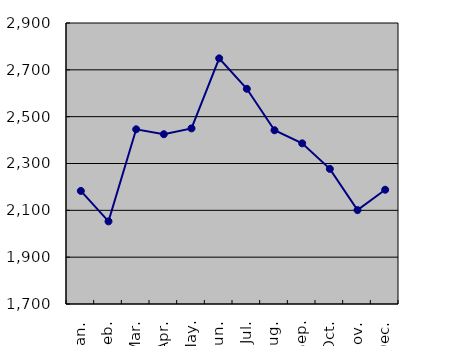
| Category | Series 0 |
|---|---|
| Jan. | 2183 |
| Feb. | 2053 |
| Mar. | 2446 |
| Apr. | 2425 |
| May. | 2450 |
| Jun. | 2749 |
| Jul. | 2619 |
| Aug. | 2442 |
| Sep. | 2386 |
| Oct. | 2277 |
| Nov. | 2101 |
| Dec. | 2188 |